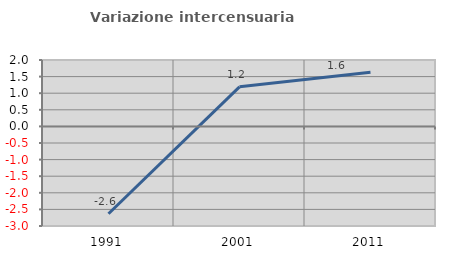
| Category | Variazione intercensuaria annua |
|---|---|
| 1991.0 | -2.63 |
| 2001.0 | 1.192 |
| 2011.0 | 1.63 |